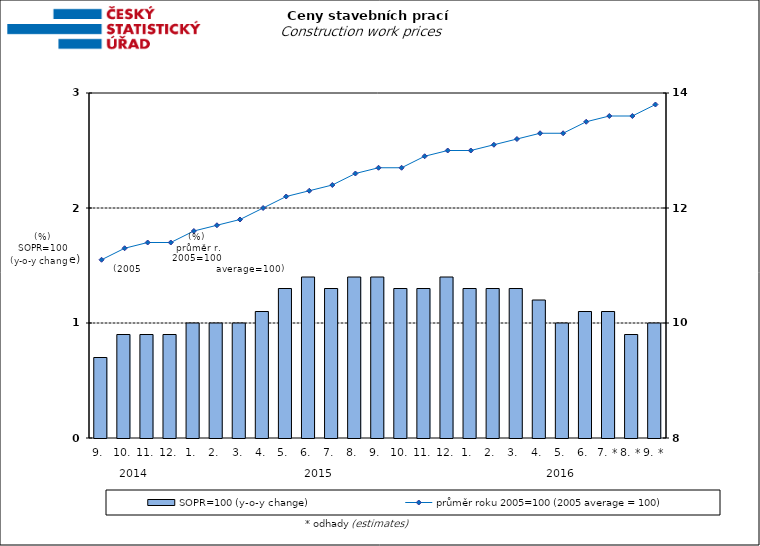
| Category | SOPR=100 (y-o-y change)   |
|---|---|
| 0 | 0.7 |
| 1 | 0.9 |
| 2 | 0.9 |
| 3 | 0.9 |
| 4 | 1 |
| 5 | 1 |
| 6 | 1 |
| 7 | 1.1 |
| 8 | 1.3 |
| 9 | 1.4 |
| 10 | 1.3 |
| 11 | 1.4 |
| 12 | 1.4 |
| 13 | 1.3 |
| 14 | 1.3 |
| 15 | 1.4 |
| 16 | 1.3 |
| 17 | 1.3 |
| 18 | 1.3 |
| 19 | 1.2 |
| 20 | 1 |
| 21 | 1.1 |
| 22 | 1.1 |
| 23 | 0.9 |
| 24 | 1 |